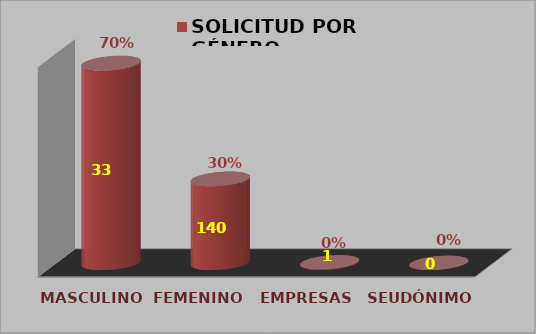
| Category | SOLICITUD POR GÉNERO |
|---|---|
| MASCULINO | 0.703 |
| FEMENINO | 0.295 |
| EMPRESAS | 0.002 |
| SEUDÓNIMO | 0 |